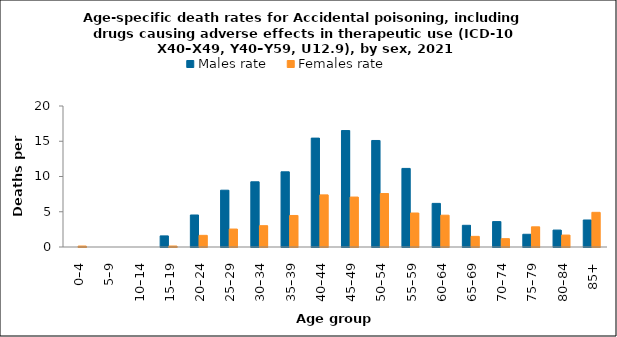
| Category | Males rate | Females rate |
|---|---|---|
| 0–4 | 0 | 0.136 |
| 5–9 | 0 | 0 |
| 10–14 | 0 | 0 |
| 15–19 | 1.575 | 0.139 |
| 20–24 | 4.539 | 1.653 |
| 25–29 | 8.057 | 2.545 |
| 30–34 | 9.25 | 3.024 |
| 35–39 | 10.665 | 4.472 |
| 40–44 | 15.443 | 7.393 |
| 45–49 | 16.518 | 7.085 |
| 50–54 | 15.11 | 7.585 |
| 55–59 | 11.147 | 4.823 |
| 60–64 | 6.187 | 4.51 |
| 65–69 | 3.077 | 1.509 |
| 70–74 | 3.606 | 1.182 |
| 75–79 | 1.805 | 2.862 |
| 80–84 | 2.4 | 1.692 |
| 85+ | 3.831 | 4.916 |